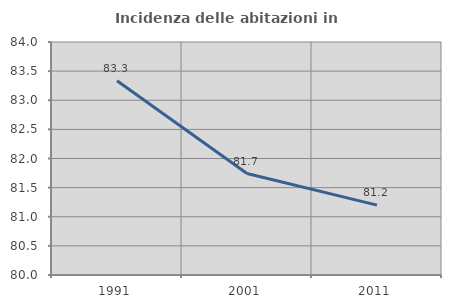
| Category | Incidenza delle abitazioni in proprietà  |
|---|---|
| 1991.0 | 83.333 |
| 2001.0 | 81.741 |
| 2011.0 | 81.2 |